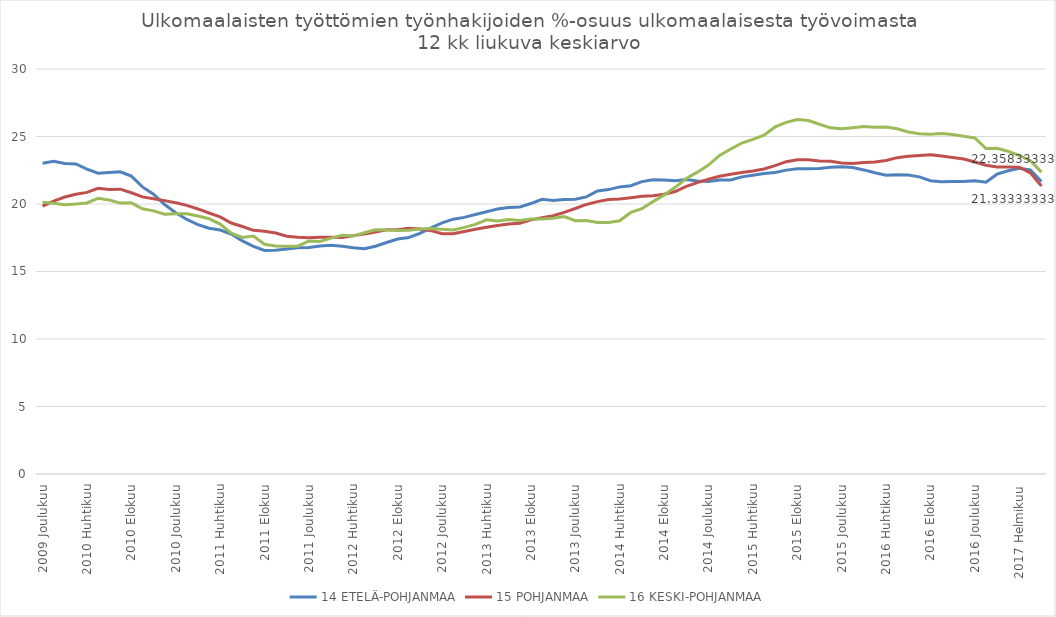
| Category | 14 ETELÄ-POHJANMAA | 15 POHJANMAA | 16 KESKI-POHJANMAA |
|---|---|---|---|
| 2009 Joulukuu | 23.025 | 19.85 | 20.133 |
| 2010 Tammikuu | 23.158 | 20.217 | 20.058 |
| 2010 Helmikuu | 23 | 20.517 | 19.95 |
| 2010 Maaliskuu | 22.967 | 20.725 | 20 |
| 2010 Huhtikuu | 22.583 | 20.858 | 20.075 |
| 2010 Toukokuu | 22.283 | 21.167 | 20.425 |
| 2010 Kesäkuu | 22.325 | 21.075 | 20.292 |
| 2010 Heinäkuu | 22.383 | 21.1 | 20.067 |
| 2010 Elokuu | 22.067 | 20.833 | 20.083 |
| 2010 Syyskuu | 21.267 | 20.525 | 19.65 |
| 2010 Lokakuu | 20.725 | 20.383 | 19.492 |
| 2010 Marraskuu | 19.958 | 20.25 | 19.242 |
| 2010 Joulukuu | 19.35 | 20.092 | 19.275 |
| 2011 Tammikuu | 18.858 | 19.9 | 19.283 |
| 2011 Helmikuu | 18.475 | 19.633 | 19.108 |
| 2011 Maaliskuu | 18.208 | 19.333 | 18.908 |
| 2011 Huhtikuu | 18.075 | 19.05 | 18.517 |
| 2011 Toukokuu | 17.775 | 18.592 | 17.833 |
| 2011 Kesäkuu | 17.267 | 18.333 | 17.525 |
| 2011 Heinäkuu | 16.867 | 18.05 | 17.625 |
| 2011 Elokuu | 16.558 | 17.975 | 17.017 |
| 2011 Syyskuu | 16.567 | 17.85 | 16.883 |
| 2011 Lokakuu | 16.658 | 17.617 | 16.867 |
| 2011 Marraskuu | 16.767 | 17.533 | 16.875 |
| 2011 Joulukuu | 16.783 | 17.5 | 17.267 |
| 2012 Tammikuu | 16.892 | 17.533 | 17.225 |
| 2012 Helmikuu | 16.942 | 17.533 | 17.475 |
| 2012 Maaliskuu | 16.875 | 17.525 | 17.683 |
| 2012 Huhtikuu | 16.758 | 17.658 | 17.625 |
| 2012 Toukokuu | 16.683 | 17.783 | 17.867 |
| 2012 Kesäkuu | 16.875 | 17.925 | 18.092 |
| 2012 Heinäkuu | 17.15 | 18.092 | 18.075 |
| 2012 Elokuu | 17.408 | 18.1 | 18.042 |
| 2012 Syyskuu | 17.525 | 18.208 | 18.05 |
| 2012 Lokakuu | 17.825 | 18.15 | 18.15 |
| 2012 Marraskuu | 18.233 | 18.025 | 18.183 |
| 2012 Joulukuu | 18.6 | 17.8 | 18.133 |
| 2013 Tammikuu | 18.875 | 17.8 | 18.083 |
| 2013 Helmikuu | 19.008 | 17.967 | 18.267 |
| 2013 Maaliskuu | 19.225 | 18.133 | 18.492 |
| 2013 Huhtikuu | 19.425 | 18.275 | 18.833 |
| 2013 Toukokuu | 19.625 | 18.4 | 18.75 |
| 2013 Kesäkuu | 19.742 | 18.525 | 18.85 |
| 2013 Heinäkuu | 19.783 | 18.567 | 18.783 |
| 2013 Elokuu | 20.033 | 18.825 | 18.883 |
| 2013 Syyskuu | 20.35 | 18.975 | 18.883 |
| 2013 Lokakuu | 20.267 | 19.133 | 18.95 |
| 2013 Marraskuu | 20.342 | 19.383 | 19.067 |
| 2013 Joulukuu | 20.358 | 19.667 | 18.767 |
| 2014 Tammikuu | 20.525 | 19.967 | 18.775 |
| 2014 Helmikuu | 20.967 | 20.175 | 18.625 |
| 2014 Maaliskuu | 21.067 | 20.333 | 18.633 |
| 2014 Huhtikuu | 21.267 | 20.367 | 18.758 |
| 2014 Toukokuu | 21.358 | 20.467 | 19.375 |
| 2014 Kesäkuu | 21.658 | 20.575 | 19.658 |
| 2014 Heinäkuu | 21.792 | 20.617 | 20.175 |
| 2014 Elokuu | 21.775 | 20.725 | 20.667 |
| 2014 Syyskuu | 21.725 | 20.925 | 21.233 |
| 2014 Lokakuu | 21.817 | 21.3 | 21.883 |
| 2014 Marraskuu | 21.7 | 21.583 | 22.358 |
| 2014 Joulukuu | 21.658 | 21.833 | 22.883 |
| 2015 Tammikuu | 21.783 | 22.058 | 23.6 |
| 2015 Helmikuu | 21.775 | 22.208 | 24.075 |
| 2015 Maaliskuu | 22.008 | 22.333 | 24.508 |
| 2015 Huhtikuu | 22.133 | 22.442 | 24.792 |
| 2015 Toukokuu | 22.258 | 22.592 | 25.1 |
| 2015 Kesäkuu | 22.333 | 22.842 | 25.708 |
| 2015 Heinäkuu | 22.508 | 23.133 | 26.05 |
| 2015 Elokuu | 22.617 | 23.283 | 26.258 |
| 2015 Syyskuu | 22.608 | 23.283 | 26.183 |
| 2015 Lokakuu | 22.625 | 23.183 | 25.908 |
| 2015 Marraskuu | 22.725 | 23.158 | 25.642 |
| 2015 Joulukuu | 22.758 | 23.033 | 25.575 |
| 2016 Tammikuu | 22.708 | 23.008 | 25.65 |
| 2016 Helmikuu | 22.525 | 23.075 | 25.742 |
| 2016 Maaliskuu | 22.317 | 23.117 | 25.692 |
| 2016 Huhtikuu | 22.133 | 23.217 | 25.7 |
| 2016 Toukokuu | 22.167 | 23.433 | 25.575 |
| 2016 Kesäkuu | 22.15 | 23.542 | 25.333 |
| 2016 Heinäkuu | 22.008 | 23.592 | 25.2 |
| 2016 Elokuu | 21.725 | 23.65 | 25.158 |
| 2016 Syyskuu | 21.642 | 23.55 | 25.225 |
| 2016 Lokakuu | 21.675 | 23.442 | 25.15 |
| 2016 Marraskuu | 21.667 | 23.333 | 25.017 |
| 2016 Joulukuu | 21.717 | 23.108 | 24.892 |
| 2016 Marraskuu | 21.608 | 22.867 | 24.108 |
| 2016 Joulukuu | 22.208 | 22.742 | 24.133 |
| 2017 Tammikuu | 22.467 | 22.733 | 23.9 |
| 2017 Helmikuu | 22.642 | 22.725 | 23.608 |
| 2017 Maaliskuu | 22.517 | 22.308 | 23.208 |
| 2017 Huhtikuu | 21.667 | 21.333 | 22.358 |